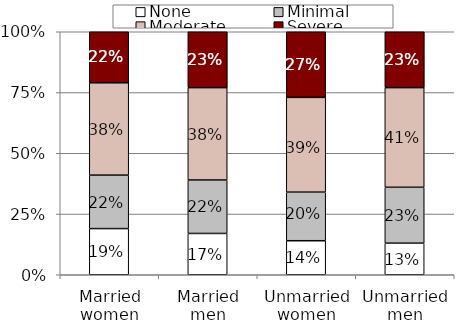
| Category | None | Minimal | Moderate | Severe |
|---|---|---|---|---|
| Married women | 0.19 | 0.22 | 0.38 | 0.22 |
| Married men | 0.17 | 0.22 | 0.38 | 0.23 |
| Unmarried women | 0.14 | 0.2 | 0.39 | 0.27 |
| Unmarried men | 0.13 | 0.23 | 0.41 | 0.23 |